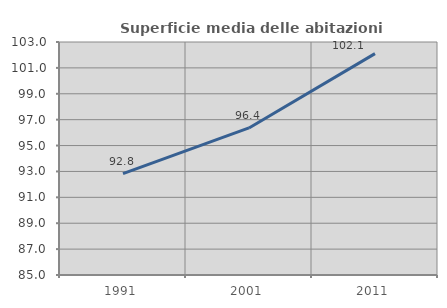
| Category | Superficie media delle abitazioni occupate |
|---|---|
| 1991.0 | 92.838 |
| 2001.0 | 96.361 |
| 2011.0 | 102.103 |